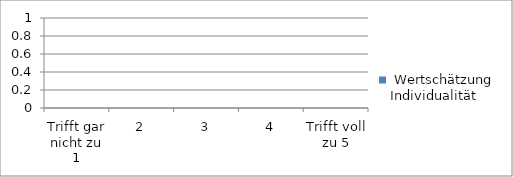
| Category |  Wertschätzung Individualität |
|---|---|
| Trifft gar nicht zu 1 | 0 |
| 2 | 0 |
| 3 | 0 |
| 4 | 0 |
| Trifft voll zu 5 | 0 |